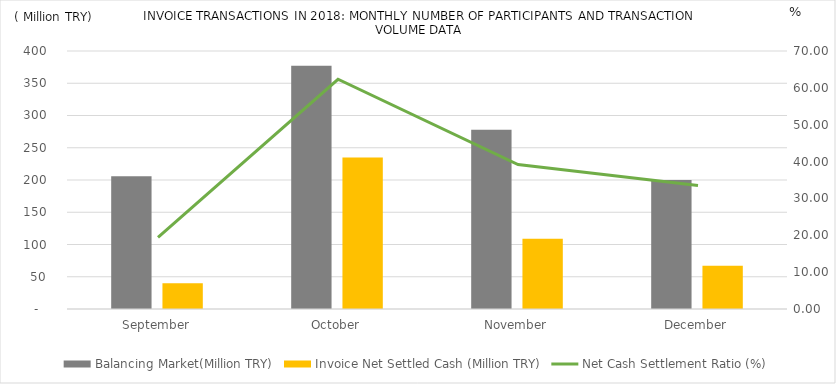
| Category | Balancing Market(Million TRY) | Invoice Net Settled Cash (Million TRY) |
|---|---|---|
| September | 206 | 40 |
| October | 377 | 235 |
| November | 278 | 109 |
| December | 200 | 67 |